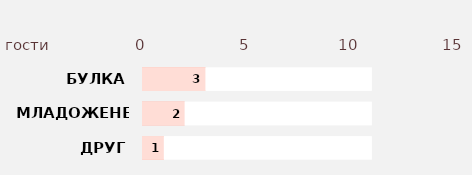
| Category | Series 2 | Series 3 | Series 1 | Series 0 |
|---|---|---|---|---|
| OTHER | 11 | 1 | 11 | 1 |
| SPOUSE-TO-BE 2 | 11 | 2 | 11 | 2 |
| SPOUSE-TO-BE 1 | 11 | 3 | 11 | 3 |